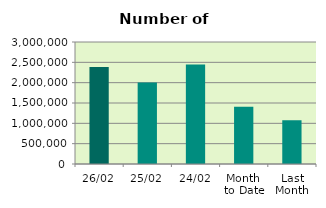
| Category | Series 0 |
|---|---|
| 26/02 | 2384994 |
| 25/02 | 2005574 |
| 24/02 | 2444356 |
| Month 
to Date | 1408738.444 |
| Last
Month | 1075899.909 |